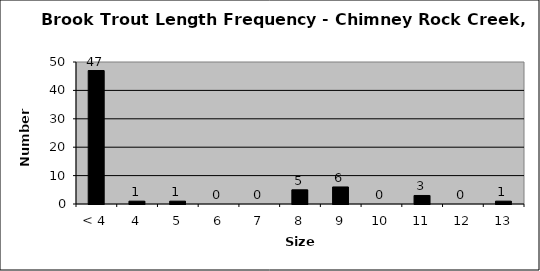
| Category | Series 0 |
|---|---|
| < 4 | 47 |
| 4 | 1 |
| 5 | 1 |
| 6 | 0 |
| 7 | 0 |
| 8 | 5 |
| 9 | 6 |
| 10 | 0 |
| 11 | 3 |
| 12 | 0 |
| 13 | 1 |